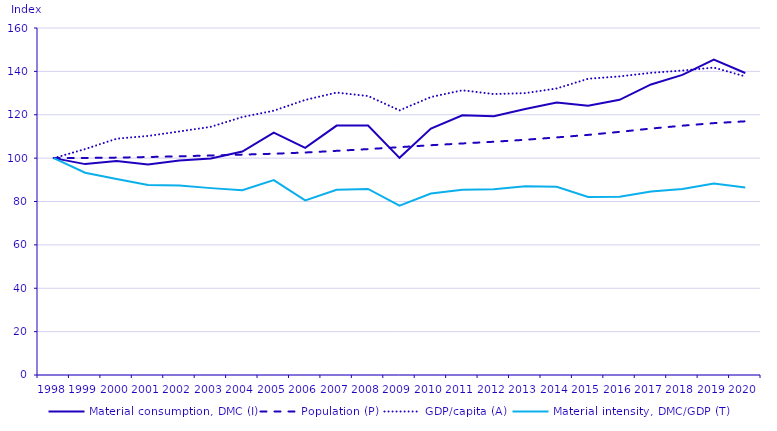
| Category | Material consumption, DMC (I) | Population (P) | GDP/capita (A) | Material intensity, DMC/GDP (T) |
|---|---|---|---|---|
| 1998.0 | 100 | 100 | 100 | 100 |
| 1999.0 | 97.241 | 100.079 | 104.165 | 93.279 |
| 2000.0 | 98.687 | 100.237 | 108.957 | 90.36 |
| 2001.0 | 97.091 | 100.508 | 110.239 | 87.628 |
| 2002.0 | 98.892 | 100.836 | 112.294 | 87.335 |
| 2003.0 | 99.824 | 101.22 | 114.452 | 86.167 |
| 2004.0 | 103.026 | 101.616 | 118.951 | 85.235 |
| 2005.0 | 111.766 | 102.022 | 121.864 | 89.896 |
| 2006.0 | 104.735 | 102.593 | 126.837 | 80.488 |
| 2007.0 | 114.994 | 103.357 | 130.23 | 85.433 |
| 2008.0 | 114.987 | 104.165 | 128.637 | 85.815 |
| 2009.0 | 100.136 | 105.056 | 122.01 | 78.121 |
| 2010.0 | 113.621 | 105.956 | 128.175 | 83.662 |
| 2011.0 | 119.769 | 106.759 | 131.276 | 85.459 |
| 2012.0 | 119.333 | 107.551 | 129.542 | 85.651 |
| 2013.0 | 122.651 | 108.467 | 129.974 | 87 |
| 2014.0 | 125.597 | 109.548 | 132.111 | 86.783 |
| 2015.0 | 124.169 | 110.713 | 136.59 | 82.11 |
| 2016.0 | 126.884 | 112.113 | 137.678 | 82.203 |
| 2017.0 | 133.984 | 113.633 | 139.323 | 84.63 |
| 2018.0 | 138.38 | 114.961 | 140.399 | 85.735 |
| 2019.0 | 145.399 | 116.132 | 141.744 | 88.329 |
| 2020.0 | 139.253 | 116.975 | 137.669 | 86.472 |